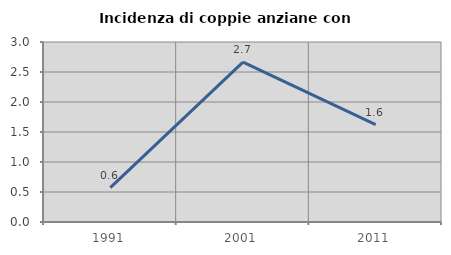
| Category | Incidenza di coppie anziane con figli |
|---|---|
| 1991.0 | 0.573 |
| 2001.0 | 2.665 |
| 2011.0 | 1.623 |